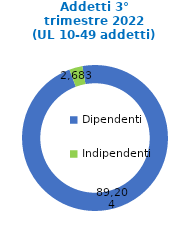
| Category | Series 0 |
|---|---|
| Dipendenti | 89204 |
| Indipendenti | 2683 |